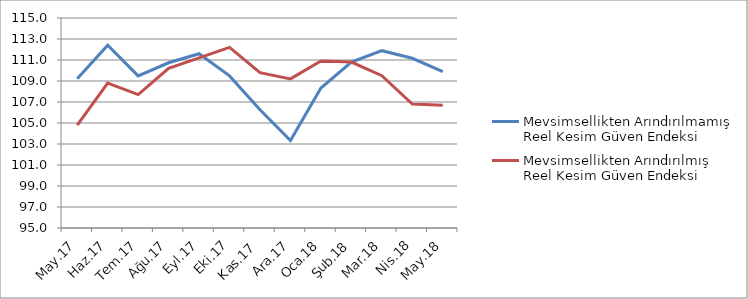
| Category | Mevsimsellikten Arındırılmamış Reel Kesim Güven Endeksi | Mevsimsellikten Arındırılmış Reel Kesim Güven Endeksi |
|---|---|---|
| May.17 | 109.225 | 104.8 |
| Haz.17 | 112.412 | 108.8 |
| Tem.17 | 109.488 | 107.7 |
| Ağu.17 | 110.738 | 110.2 |
| Eyl.17 | 111.6 | 111.2 |
| Eki.17 | 109.488 | 112.2 |
| Kas.17 | 106.262 | 109.8 |
| Ara.17 | 103.325 | 109.2 |
| Oca.18 | 108.325 | 110.9 |
| Şub.18 | 110.8 | 110.8 |
| Mar.18 | 111.888 | 109.5 |
| Nis.18 | 111.163 | 106.8 |
| May.18 | 109.9 | 106.7 |